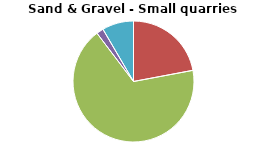
| Category | Series 0 |
|---|---|
| DRILLING AND BLASTING | 0 |
| MATERIAL PROCESSING | 10.215 |
| INTERNAL TRANSPORT | 31.351 |
| MATERIAL HANDLING OPERATION | 0.876 |
| WIND EROSION FROM STOCKPILES | 3.903 |